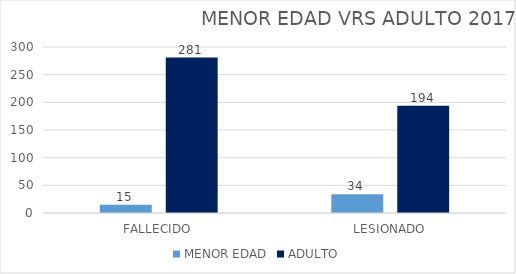
| Category | MENOR EDAD | ADULTO |
|---|---|---|
| FALLECIDO | 15 | 281 |
| LESIONADO | 34 | 194 |